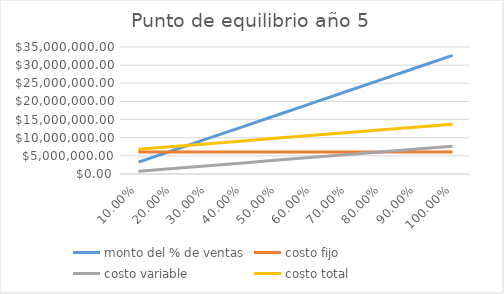
| Category | monto del % de ventas | costo fijo | costo variable | costo total |
|---|---|---|---|---|
| 0.1 | 3267720 | 6061735.987 | 765981.999 | 6827717.986 |
| 0.2 | 6535440 | 6061735.987 | 1531963.999 | 7593699.985 |
| 0.3 | 9803160 | 6061735.987 | 2297945.998 | 8359681.985 |
| 0.4 | 13070880 | 6061735.987 | 3063927.998 | 9125663.984 |
| 0.5 | 16338600 | 6061735.987 | 3829909.997 | 9891645.984 |
| 0.6 | 19606320 | 6061735.987 | 4595891.996 | 10657627.983 |
| 0.7 | 22874040 | 6061735.987 | 5361873.996 | 11423609.982 |
| 0.8 | 26141760 | 6061735.987 | 6127855.995 | 12189591.982 |
| 0.9 | 29409480 | 6061735.987 | 6893837.995 | 12955573.981 |
| 1.0 | 32677200 | 6061735.987 | 7659819.994 | 13721555.98 |